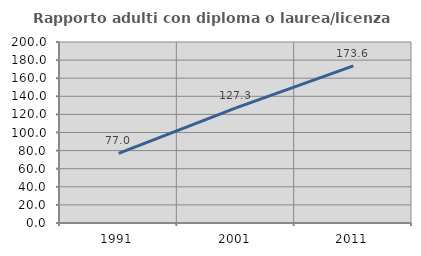
| Category | Rapporto adulti con diploma o laurea/licenza media  |
|---|---|
| 1991.0 | 77.011 |
| 2001.0 | 127.257 |
| 2011.0 | 173.609 |